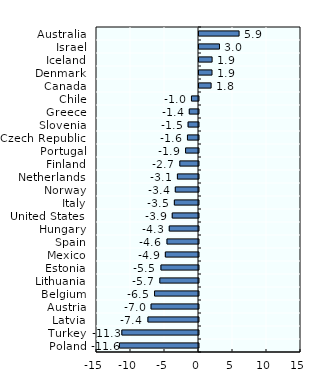
| Category | Pension funds |
|---|---|
| Australia | 5.896 |
| Israel | 3.011 |
| Iceland | 1.93 |
| Denmark | 1.915 |
| Canada | 1.783 |
| Chile | -1.034 |
| Greece | -1.353 |
| Slovenia | -1.53 |
| Czech Republic | -1.623 |
| Portugal | -1.902 |
| Finland | -2.75 |
| Netherlands | -3.101 |
| Norway | -3.41 |
| Italy | -3.548 |
| United States | -3.861 |
| Hungary | -4.3 |
| Spain | -4.632 |
| Mexico | -4.875 |
| Estonia | -5.523 |
| Lithuania | -5.685 |
| Belgium | -6.462 |
| Austria | -6.974 |
| Latvia | -7.439 |
| Turkey | -11.273 |
| Poland | -11.629 |